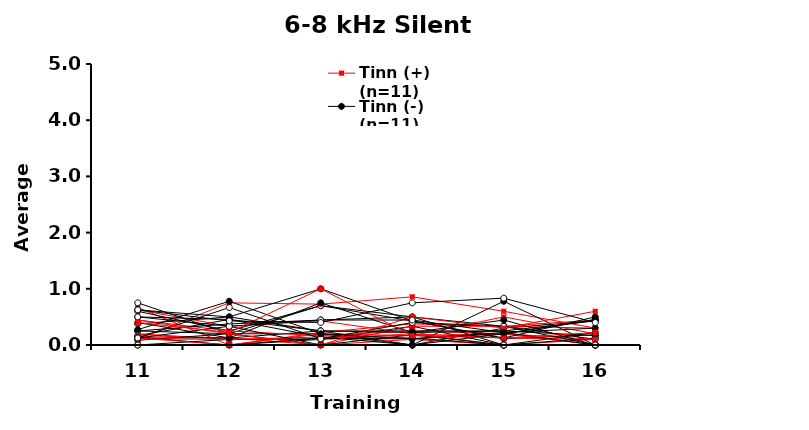
| Category | Tinn (+) (n=11) | Tinn (-) (n=11) | Ctrl (n=8) | CI03 | CI04 | CI05 | CI06 | CI07 | CI08 | CI09 | CI10 | DS18 | CI11 | CI12 | DS19 | CI13 | CI14 | DS20 | CI15 | CI16 | DS21 | CI17 | CI18 | DS22 | CI19 | CI20 | DS23 | CI21 | CI22 | DS24 |
|---|---|---|---|---|---|---|---|---|---|---|---|---|---|---|---|---|---|---|---|---|---|---|---|---|---|---|---|---|---|---|
| 11.0 | 0.667 | 0.167 | 0.6 | 0.143 | 0.25 | 0.167 | 0.2 | 0 | 0 | 0.625 | 0.125 | 0.75 | 0.083 | 0.111 | 0 | 0.5 | 0.444 | 0.25 | 0.111 | 0.125 | 0.375 | 0.125 | 0.625 | 0.125 | 0.4 | 0.444 | 0.5 | 0.273 | 0.4 | 0.625 |
| 12.0 | 0 | 0.455 | 0.25 | 0 | 0.2 | 0.125 | 0.1 | 0 | 0 | 0.333 | 0.125 | 0.2 | 0.2 | 0.75 | 0.1 | 0.455 | 0.25 | 0.375 | 0.1 | 0 | 0.5 | 0.333 | 0.5 | 0.667 | 0.125 | 0.2 | 0.333 | 0.778 | 0.222 | 0.429 |
| 13.0 | 0.2 | 0.25 | 0.7 | 0.1 | 0.2 | 0 | 0.1 | 0 | 0.125 | 0.429 | 0.25 | 0.7 | 0 | 0.727 | 0.111 | 0.143 | 0.167 | 0.444 | 0.143 | 0.222 | 0.25 | 0 | 1 | 0.111 | 0.75 | 0 | 0.444 | 0.2 | 1 | 0.4 |
| 14.0 | 0.167 | 0 | 0.429 | 0.333 | 0 | 0.333 | 0.2 | 0.1 | 0.125 | 0.2 | 0.25 | 0.5 | 0.182 | 0.857 | 0.111 | 0 | 0.25 | 0.5 | 0.167 | 0.375 | 0.222 | 0 | 0.429 | 0.4 | 0.222 | 0.5 | 0.444 | 0.111 | 0.167 | 0.75 |
| 15.0 | 0.5 | 0.3 | 0.111 | 0 | 0 | 0.333 | 0.125 | 0 | 0 | 0 | 0.25 | 0.333 | 0 | 0.6 | 0.2 | 0.778 | 0.2 | 0 | 0.2 | 0.333 | 0.25 | 0.2 | 0.125 | 0.333 | 0.444 | 0.3 | 0.222 | 0.222 | 0.125 | 0.833 |
| 16.0 | 0.2 | 0.429 | 0.182 | 0 | 0.222 | 0.3 | 0.1 | 0.1 | 0.125 | 0 | 0.167 | 0.1 | 0 | 0.3 | 0.444 | 0 | 0.1 | 0 | 0 | 0.444 | 0.429 | 0.455 | 0.5 | 0 | 0 | 0.6 | 0 | 0.3 | 0.222 | 0.4 |